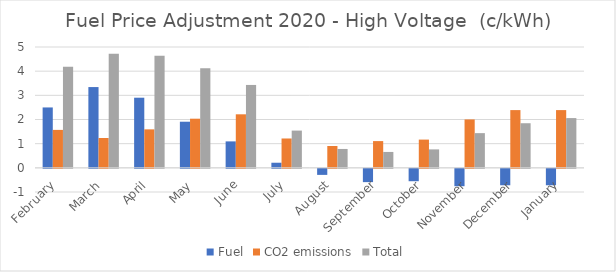
| Category | Fuel | CO2 emissions | Total |
|---|---|---|---|
| February | 2.499 | 1.57 | 4.178 |
| March | 3.342 | 1.235 | 4.716 |
| April | 2.902 | 1.592 | 4.64 |
| May | 1.908 | 2.033 | 4.118 |
| June | 1.094 | 2.215 | 3.43 |
| July | 0.211 | 1.214 | 1.541 |
| August | -0.25 | 0.904 | 0.781 |
| September | -0.55 | 1.106 | 0.658 |
| October | -0.513 | 1.168 | 0.763 |
| November | -0.719 | 2.003 | 1.436 |
| December | -0.68 | 2.389 | 1.845 |
| January | -0.68 | 2.389 | 2.059 |